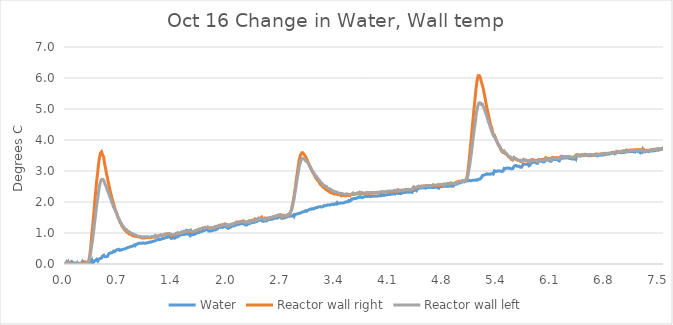
| Category | Water | Reactor wall right | Reactor wall left |
|---|---|---|---|
| 0.0015577622222222223 | 0 | 0 | 0 |
| 0.008027616666666666 | 0.023 | 0.004 | 0.005 |
| 0.014572455555555554 | 0.044 | 0.029 | 0.056 |
| 0.02137698611111111 | 0.004 | -0.011 | 0.006 |
| 0.028150972222222223 | 0.017 | 0.005 | 0.019 |
| 0.03498602777777778 | 0.058 | 0.04 | 0.029 |
| 0.04182113888888889 | -0.016 | -0.028 | -0.022 |
| 0.048596499999999994 | 0.018 | -0.005 | -0.014 |
| 0.055370472222222224 | 0.029 | 0.015 | 0.009 |
| 0.06214444444444445 | 0.032 | -0.035 | -0.028 |
| 0.06897952777777779 | 0.009 | -0.022 | 0 |
| 0.07578405555555556 | 0.063 | -0.003 | 0.008 |
| 0.08261913888888889 | -0.018 | -0.065 | -0.024 |
| 0.08939311111111112 | -0.002 | -0.02 | -0.014 |
| 0.09610600000000001 | 0.033 | -0.004 | -0.017 |
| 0.1029716111111111 | 0.01 | -0.025 | 0.003 |
| 0.10977613888888889 | -0.017 | -0.039 | -0.031 |
| 0.11655155555555556 | 0.016 | -0.023 | -0.015 |
| 0.12337130555555556 | 0.03 | -0.005 | 0.008 |
| 0.13017602777777776 | -0.014 | -0.045 | -0.048 |
| 0.13694983333333333 | 0.007 | -0.03 | -0.025 |
| 0.14370852777777776 | 0.016 | 0.004 | -0.009 |
| 0.15054361111111111 | 0.038 | 0.013 | 0.024 |
| 0.15731758333333334 | -0.002 | -0.054 | -0.031 |
| 0.16413738888888887 | -0.011 | -0.031 | -0.008 |
| 0.17091138888888888 | 0.024 | -0.007 | 0.002 |
| 0.1776867222222222 | 0.027 | -0.001 | -0.003 |
| 0.18449125 | 0.011 | -0.018 | -0.004 |
| 0.19132633333333335 | -0.006 | -0.021 | -0.027 |
| 0.19810033333333332 | 0.007 | -0.01 | -0.004 |
| 0.20487430555555555 | 0.023 | -0.005 | -0.004 |
| 0.2117246388888889 | 0.063 | 0.031 | 0.006 |
| 0.2184986388888889 | 0.002 | -0.021 | -0.005 |
| 0.22537952777777778 | -0.002 | -0.025 | -0.006 |
| 0.23210769444444446 | 0.007 | -0.021 | 0.023 |
| 0.23889694444444445 | 0.054 | 0.007 | 0.015 |
| 0.24567230555555555 | 0.057 | 0.04 | 0.036 |
| 0.2525073888888889 | 0.027 | -0.011 | -0.006 |
| 0.2592508055555556 | -0.008 | -0.011 | 0.006 |
| 0.2660901111111111 | 0.03 | 0.008 | 0.014 |
| 0.27287516666666667 | 0.035 | 0.018 | 0.019 |
| 0.279695 | 0.063 | 0.049 | 0.047 |
| 0.28643833333333335 | 0.05 | 0.07 | 0.06 |
| 0.2933344444444444 | 0.043 | 0.077 | 0.057 |
| 0.3000933333333333 | 0.018 | 0.146 | 0.092 |
| 0.3068825 | 0.041 | 0.259 | 0.175 |
| 0.3137022222222222 | 0.036 | 0.386 | 0.25 |
| 0.3204777777777778 | 0.059 | 0.543 | 0.368 |
| 0.3272363888888889 | 0.084 | 0.739 | 0.49 |
| 0.33404083333333334 | 0.119 | 0.944 | 0.621 |
| 0.3408761111111111 | 0.042 | 1.11 | 0.713 |
| 0.3476805555555556 | 0.045 | 1.285 | 0.849 |
| 0.35443916666666664 | 0.048 | 1.498 | 0.994 |
| 0.36127444444444445 | 0.066 | 1.679 | 1.128 |
| 0.3680483333333333 | 0.102 | 1.897 | 1.303 |
| 0.3748375 | 0.11 | 2.122 | 1.432 |
| 0.3816127777777778 | 0.115 | 2.303 | 1.586 |
| 0.38843277777777774 | 0.131 | 2.482 | 1.729 |
| 0.3952219444444444 | 0.151 | 2.67 | 1.89 |
| 0.40199583333333333 | 0.14 | 2.817 | 2.007 |
| 0.4088158333333334 | 0.099 | 2.966 | 2.119 |
| 0.41565083333333336 | 0.134 | 3.139 | 2.246 |
| 0.42247055555555557 | 0.14 | 3.287 | 2.386 |
| 0.4292294444444445 | 0.168 | 3.406 | 2.506 |
| 0.43600333333333335 | 0.168 | 3.496 | 2.575 |
| 0.44279250000000003 | 0.181 | 3.577 | 2.642 |
| 0.4495986111111111 | 0.204 | 3.603 | 2.708 |
| 0.45640305555555555 | 0.189 | 3.621 | 2.738 |
| 0.4631922222222222 | 0.214 | 3.565 | 2.733 |
| 0.4700272222222222 | 0.259 | 3.556 | 2.746 |
| 0.47680138888888884 | 0.268 | 3.49 | 2.723 |
| 0.48360583333333335 | 0.281 | 3.451 | 2.716 |
| 0.4903797222222222 | 0.245 | 3.322 | 2.664 |
| 0.49715388888888884 | 0.215 | 3.194 | 2.599 |
| 0.5039888888888888 | 0.235 | 3.127 | 2.554 |
| 0.5107475 | 0.231 | 3.03 | 2.52 |
| 0.5175688888888889 | 0.236 | 2.938 | 2.474 |
| 0.5243427777777778 | 0.26 | 2.849 | 2.421 |
| 0.5311777777777777 | 0.247 | 2.772 | 2.39 |
| 0.5379825 | 0.284 | 2.683 | 2.324 |
| 0.5447563888888889 | 0.304 | 2.603 | 2.288 |
| 0.5515761111111112 | 0.339 | 2.514 | 2.24 |
| 0.5583502777777778 | 0.326 | 2.442 | 2.181 |
| 0.5650936111111111 | 0.354 | 2.361 | 2.135 |
| 0.5719897222222222 | 0.357 | 2.279 | 2.094 |
| 0.5787788888888888 | 0.359 | 2.228 | 2.066 |
| 0.5855530555555556 | 0.377 | 2.136 | 1.989 |
| 0.5923130555555556 | 0.37 | 2.077 | 1.959 |
| 0.5991483333333334 | 0.38 | 2.019 | 1.91 |
| 0.6059222222222223 | 0.414 | 1.96 | 1.842 |
| 0.6127266666666666 | 0.401 | 1.899 | 1.831 |
| 0.6195158333333334 | 0.396 | 1.843 | 1.788 |
| 0.6263358333333334 | 0.401 | 1.774 | 1.742 |
| 0.6330944444444444 | 0.429 | 1.733 | 1.706 |
| 0.6399447222222222 | 0.442 | 1.672 | 1.668 |
| 0.6467186111111111 | 0.46 | 1.638 | 1.637 |
| 0.6535386111111111 | 0.466 | 1.598 | 1.576 |
| 0.6603138888888889 | 0.453 | 1.528 | 1.517 |
| 0.6671488888888889 | 0.461 | 1.487 | 1.512 |
| 0.6739230555555555 | 0.474 | 1.452 | 1.46 |
| 0.6807580555555555 | 0.452 | 1.407 | 1.434 |
| 0.6875013888888889 | 0.441 | 1.346 | 1.38 |
| 0.6943366666666667 | 0.453 | 1.332 | 1.356 |
| 0.7010952777777778 | 0.46 | 1.303 | 1.323 |
| 0.7079150000000001 | 0.446 | 1.248 | 1.292 |
| 0.7146891666666666 | 0.459 | 1.242 | 1.268 |
| 0.7214936111111111 | 0.472 | 1.198 | 1.232 |
| 0.7282688888888889 | 0.479 | 1.17 | 1.219 |
| 0.7350580555555555 | 0.472 | 1.142 | 1.201 |
| 0.7419238888888888 | 0.482 | 1.129 | 1.163 |
| 0.7486672222222223 | 0.49 | 1.095 | 1.15 |
| 0.7554869444444445 | 0.492 | 1.082 | 1.121 |
| 0.7622916666666667 | 0.505 | 1.057 | 1.134 |
| 0.7690808333333333 | 0.51 | 1.039 | 1.114 |
| 0.7759158333333334 | 0.523 | 1.028 | 1.072 |
| 0.7826441666666666 | 0.528 | 1.02 | 1.08 |
| 0.7894347222222222 | 0.518 | 1.008 | 1.059 |
| 0.7962391666666666 | 0.539 | 1.005 | 1.057 |
| 0.8031202777777778 | 0.531 | 0.969 | 1.044 |
| 0.8098941666666667 | 0.549 | 0.961 | 1.016 |
| 0.8166986111111111 | 0.541 | 0.964 | 1.018 |
| 0.8235030555555555 | 0.562 | 0.948 | 1.018 |
| 0.8302466666666667 | 0.549 | 0.951 | 0.99 |
| 0.8370205555555555 | 0.57 | 0.925 | 0.998 |
| 0.843825 | 0.575 | 0.917 | 0.982 |
| 0.8506602777777778 | 0.577 | 0.904 | 0.954 |
| 0.8574647222222223 | 0.58 | 0.907 | 0.964 |
| 0.86424 | 0.605 | 0.908 | 0.951 |
| 0.8711211111111111 | 0.597 | 0.898 | 0.949 |
| 0.8778644444444444 | 0.588 | 0.894 | 0.936 |
| 0.8846383333333333 | 0.629 | 0.889 | 0.938 |
| 0.8914736111111111 | 0.619 | 0.889 | 0.91 |
| 0.8982016666666667 | 0.638 | 0.888 | 0.915 |
| 0.905021388888889 | 0.642 | 0.885 | 0.889 |
| 0.9117802777777778 | 0.654 | 0.885 | 0.897 |
| 0.9186305555555556 | 0.65 | 0.867 | 0.892 |
| 0.9254349999999999 | 0.668 | 0.87 | 0.889 |
| 0.9322102777777778 | 0.655 | 0.878 | 0.897 |
| 0.9389997222222222 | 0.668 | 0.878 | 0.894 |
| 0.9458347222222222 | 0.676 | 0.865 | 0.879 |
| 0.9526238888888888 | 0.668 | 0.852 | 0.884 |
| 0.9594591666666666 | 0.676 | 0.849 | 0.879 |
| 0.9662483333333334 | 0.668 | 0.836 | 0.871 |
| 0.9729763888888889 | 0.676 | 0.834 | 0.879 |
| 0.9797811111111111 | 0.681 | 0.839 | 0.874 |
| 0.9865702777777777 | 0.681 | 0.839 | 0.879 |
| 0.99339 | 0.668 | 0.836 | 0.884 |
| 1.0001652777777776 | 0.658 | 0.836 | 0.863 |
| 1.0069547222222222 | 0.666 | 0.844 | 0.874 |
| 1.0137744444444445 | 0.681 | 0.831 | 0.884 |
| 1.0205636111111112 | 0.681 | 0.852 | 0.881 |
| 1.0273836111111112 | 0.676 | 0.841 | 0.876 |
| 1.0341575 | 0.686 | 0.849 | 0.879 |
| 1.0409466666666667 | 0.666 | 0.852 | 0.861 |
| 1.047751388888889 | 0.694 | 0.854 | 0.869 |
| 1.0545252777777778 | 0.704 | 0.849 | 0.874 |
| 1.0613602777777777 | 0.707 | 0.844 | 0.856 |
| 1.0681358333333333 | 0.712 | 0.86 | 0.887 |
| 1.074986111111111 | 0.702 | 0.849 | 0.876 |
| 1.081836388888889 | 0.704 | 0.847 | 0.899 |
| 1.088595 | 0.722 | 0.867 | 0.881 |
| 1.095353888888889 | 0.728 | 0.854 | 0.879 |
| 1.1021277777777778 | 0.728 | 0.867 | 0.881 |
| 1.1089016666666667 | 0.738 | 0.854 | 0.887 |
| 1.1157522222222223 | 0.743 | 0.872 | 0.871 |
| 1.1225719444444444 | 0.751 | 0.87 | 0.894 |
| 1.129361111111111 | 0.746 | 0.87 | 0.912 |
| 1.1361366666666668 | 0.746 | 0.88 | 0.879 |
| 1.1429105555555557 | 0.766 | 0.893 | 0.894 |
| 1.1496844444444443 | 0.766 | 0.885 | 0.907 |
| 1.1565349999999999 | 0.782 | 0.888 | 0.892 |
| 1.1633241666666665 | 0.789 | 0.914 | 0.907 |
| 1.1700980555555556 | 0.795 | 0.896 | 0.91 |
| 1.1768719444444444 | 0.782 | 0.906 | 0.91 |
| 1.1837225 | 0.784 | 0.906 | 0.905 |
| 1.1905575 | 0.8 | 0.929 | 0.912 |
| 1.1972855555555555 | 0.797 | 0.937 | 0.925 |
| 1.204061111111111 | 0.81 | 0.921 | 0.933 |
| 1.210896111111111 | 0.805 | 0.927 | 0.956 |
| 1.217731111111111 | 0.795 | 0.934 | 0.923 |
| 1.2245052777777778 | 0.823 | 0.927 | 0.93 |
| 1.2312791666666665 | 0.828 | 0.939 | 0.946 |
| 1.238083611111111 | 0.826 | 0.947 | 0.954 |
| 1.2448577777777778 | 0.849 | 0.937 | 0.961 |
| 1.2516927777777778 | 0.838 | 0.945 | 0.943 |
| 1.2584972222222222 | 0.851 | 0.945 | 0.941 |
| 1.2653169444444443 | 0.851 | 0.968 | 0.959 |
| 1.2720772222222223 | 0.841 | 0.958 | 0.969 |
| 1.2788969444444445 | 0.862 | 0.958 | 0.972 |
| 1.285625 | 0.864 | 0.968 | 0.982 |
| 1.2924908333333331 | 0.877 | 0.973 | 0.972 |
| 1.2993105555555555 | 0.882 | 0.958 | 0.979 |
| 1.3060844444444446 | 0.893 | 0.978 | 0.998 |
| 1.3128738888888887 | 0.871 | 0.974 | 0.964 |
| 1.3196783333333333 | 0.857 | 0.953 | 0.961 |
| 1.3264522222222221 | 0.837 | 0.949 | 0.968 |
| 1.3332569444444446 | 0.824 | 0.913 | 0.939 |
| 1.3400627777777776 | 0.811 | 0.924 | 0.939 |
| 1.3468366666666667 | 0.834 | 0.918 | 0.934 |
| 1.3536108333333332 | 0.839 | 0.939 | 0.947 |
| 1.3604305555555556 | 0.86 | 0.947 | 0.952 |
| 1.3672044444444444 | 0.829 | 0.942 | 0.95 |
| 1.37407 | 0.834 | 0.942 | 0.965 |
| 1.3808288888888889 | 0.865 | 0.962 | 0.965 |
| 1.3876027777777777 | 0.865 | 0.947 | 0.991 |
| 1.3944225000000001 | 0.89 | 0.983 | 0.976 |
| 1.4011966666666666 | 0.861 | 0.973 | 0.955 |
| 1.4080330555555556 | 0.878 | 0.97 | 0.968 |
| 1.4148986111111113 | 0.889 | 1.005 | 0.994 |
| 1.4216269444444445 | 0.892 | 1.008 | 0.976 |
| 1.428416111111111 | 0.902 | 0.995 | 0.999 |
| 1.4351747222222222 | 0.92 | 1.008 | 0.988 |
| 1.441994722222222 | 0.938 | 0.997 | 0.999 |
| 1.4487991666666666 | 0.914 | 1.023 | 1.004 |
| 1.455603611111111 | 0.953 | 1.018 | 0.991 |
| 1.4624080555555554 | 0.925 | 1.039 | 1.017 |
| 1.4691822222222222 | 0.943 | 1.039 | 1.014 |
| 1.4759575 | 0.935 | 1.028 | 1.012 |
| 1.4827925 | 0.958 | 1.026 | 1.03 |
| 1.4895819444444445 | 0.961 | 1.044 | 1.037 |
| 1.496371111111111 | 0.951 | 1.054 | 1.022 |
| 1.5031755555555555 | 0.945 | 1.046 | 1.043 |
| 1.5099344444444445 | 0.971 | 1.059 | 1.03 |
| 1.5167847222222224 | 0.979 | 1.049 | 1.045 |
| 1.5235738888888888 | 0.966 | 1.088 | 1.066 |
| 1.5303783333333334 | 0.992 | 1.07 | 1.048 |
| 1.5371525 | 0.971 | 1.077 | 1.076 |
| 1.5439430555555556 | 0.982 | 1.085 | 1.058 |
| 1.5507780555555557 | 0.979 | 1.083 | 1.089 |
| 1.5575675000000002 | 0.976 | 1.081 | 1.073 |
| 1.5644025000000001 | 0.931 | 1.051 | 1.042 |
| 1.5711458333333332 | 0.991 | 1.078 | 1.065 |
| 1.577981111111111 | 0.927 | 1.079 | 1.047 |
| 1.5847091666666668 | 0.936 | 1.036 | 1.047 |
| 1.5915288888888888 | 0.939 | 1.051 | 1.052 |
| 1.5983488888888888 | 0.949 | 1.051 | 1.046 |
| 1.6051227777777777 | 0.959 | 1.051 | 1.041 |
| 1.6119591666666666 | 0.962 | 1.051 | 1.054 |
| 1.6187944444444444 | 0.949 | 1.072 | 1.057 |
| 1.6255377777777777 | 0.962 | 1.064 | 1.057 |
| 1.6323116666666666 | 0.98 | 1.085 | 1.062 |
| 1.6391619444444445 | 0.971 | 1.073 | 1.067 |
| 1.6459055555555555 | 0.98 | 1.064 | 1.077 |
| 1.6526794444444444 | 0.993 | 1.086 | 1.09 |
| 1.6595144444444445 | 1.011 | 1.1 | 1.085 |
| 1.6663358333333333 | 1.01 | 1.095 | 1.106 |
| 1.6730930555555557 | 1.014 | 1.117 | 1.08 |
| 1.6798683333333333 | 1.027 | 1.115 | 1.124 |
| 1.6866730555555556 | 1.022 | 1.135 | 1.126 |
| 1.6934775 | 1.034 | 1.13 | 1.111 |
| 1.7002819444444446 | 1.055 | 1.141 | 1.116 |
| 1.707056111111111 | 1.057 | 1.13 | 1.119 |
| 1.7138758333333335 | 1.05 | 1.148 | 1.121 |
| 1.7206497222222221 | 1.057 | 1.151 | 1.15 |
| 1.7275152777777778 | 1.062 | 1.151 | 1.142 |
| 1.7342894444444446 | 1.047 | 1.161 | 1.15 |
| 1.7410633333333334 | 1.073 | 1.169 | 1.137 |
| 1.747838611111111 | 1.085 | 1.169 | 1.152 |
| 1.7547197222222222 | 1.09 | 1.164 | 1.16 |
| 1.7614783333333333 | 1.083 | 1.184 | 1.175 |
| 1.7682980555555554 | 1.113 | 1.177 | 1.17 |
| 1.7750263888888889 | 1.101 | 1.174 | 1.17 |
| 1.781846111111111 | 1.111 | 1.2 | 1.173 |
| 1.7886811111111112 | 1.106 | 1.192 | 1.186 |
| 1.795455277777778 | 1.104 | 1.179 | 1.178 |
| 1.8022902777777778 | 1.061 | 1.16 | 1.154 |
| 1.8090641666666667 | 1.077 | 1.16 | 1.164 |
| 1.8158841666666667 | 1.061 | 1.151 | 1.154 |
| 1.8226288888888889 | 1.053 | 1.166 | 1.156 |
| 1.829402777777778 | 1.063 | 1.171 | 1.177 |
| 1.8362224999999999 | 1.061 | 1.171 | 1.159 |
| 1.8430425000000001 | 1.076 | 1.171 | 1.156 |
| 1.8498163888888888 | 1.086 | 1.176 | 1.169 |
| 1.8566666666666667 | 1.084 | 1.169 | 1.156 |
| 1.8634255555555557 | 1.073 | 1.184 | 1.179 |
| 1.8702605555555556 | 1.108 | 1.178 | 1.187 |
| 1.8770191666666667 | 1.099 | 1.184 | 1.182 |
| 1.8838544444444445 | 1.096 | 1.206 | 1.182 |
| 1.8906297222222221 | 1.117 | 1.2 | 1.208 |
| 1.8974341666666668 | 1.117 | 1.213 | 1.182 |
| 1.9042080555555556 | 1.136 | 1.211 | 1.2 |
| 1.9109822222222221 | 1.133 | 1.219 | 1.208 |
| 1.9177408333333335 | 1.135 | 1.235 | 1.202 |
| 1.9245605555555554 | 1.171 | 1.227 | 1.213 |
| 1.9313958333333332 | 1.145 | 1.235 | 1.215 |
| 1.9381697222222223 | 1.191 | 1.248 | 1.226 |
| 1.94502 | 1.163 | 1.255 | 1.231 |
| 1.9517955555555555 | 1.178 | 1.258 | 1.226 |
| 1.9586000000000001 | 1.178 | 1.248 | 1.249 |
| 1.9653738888888888 | 1.196 | 1.263 | 1.239 |
| 1.9721480555555555 | 1.194 | 1.286 | 1.246 |
| 1.9789525000000001 | 1.181 | 1.263 | 1.246 |
| 1.9857569444444445 | 1.212 | 1.284 | 1.251 |
| 1.9925919444444444 | 1.209 | 1.278 | 1.269 |
| 1.9993661111111112 | 1.201 | 1.281 | 1.251 |
| 2.006231666666667 | 1.209 | 1.294 | 1.269 |
| 2.012929166666667 | 1.224 | 1.297 | 1.269 |
| 2.019781111111111 | 1.193 | 1.277 | 1.254 |
| 2.026555 | 1.206 | 1.279 | 1.264 |
| 2.0333441666666667 | 1.184 | 1.276 | 1.264 |
| 2.0401183333333335 | 1.19 | 1.28 | 1.269 |
| 2.0469227777777776 | 1.149 | 1.232 | 1.227 |
| 2.0537425 | 1.164 | 1.227 | 1.245 |
| 2.060486111111111 | 1.172 | 1.242 | 1.255 |
| 2.0673669444444442 | 1.177 | 1.258 | 1.263 |
| 2.0741408333333333 | 1.177 | 1.27 | 1.247 |
| 2.080914722222222 | 1.191 | 1.283 | 1.268 |
| 2.0877208333333335 | 1.209 | 1.276 | 1.278 |
| 2.0945252777777776 | 1.197 | 1.271 | 1.278 |
| 2.1013297222222223 | 1.227 | 1.29 | 1.266 |
| 2.108103888888889 | 1.223 | 1.303 | 1.296 |
| 2.114908333333333 | 1.228 | 1.295 | 1.289 |
| 2.1217433333333333 | 1.233 | 1.318 | 1.284 |
| 2.1285175 | 1.236 | 1.316 | 1.299 |
| 2.1353066666666667 | 1.249 | 1.316 | 1.315 |
| 2.142141666666667 | 1.261 | 1.331 | 1.32 |
| 2.148931111111111 | 1.249 | 1.329 | 1.307 |
| 2.1557216666666665 | 1.264 | 1.357 | 1.33 |
| 2.1624802777777776 | 1.246 | 1.334 | 1.302 |
| 2.1693155555555554 | 1.272 | 1.352 | 1.33 |
| 2.17612 | 1.287 | 1.36 | 1.333 |
| 2.1828938888888887 | 1.284 | 1.349 | 1.333 |
| 2.1897441666666664 | 1.287 | 1.373 | 1.34 |
| 2.1965183333333336 | 1.287 | 1.357 | 1.364 |
| 2.2032616666666667 | 1.295 | 1.378 | 1.356 |
| 2.210096666666667 | 1.315 | 1.38 | 1.361 |
| 2.2168555555555556 | 1.312 | 1.383 | 1.369 |
| 2.2236155555555555 | 1.302 | 1.378 | 1.358 |
| 2.2304505555555556 | 1.325 | 1.38 | 1.374 |
| 2.237255277777778 | 1.317 | 1.393 | 1.374 |
| 2.2441055555555556 | 1.308 | 1.378 | 1.384 |
| 2.2508488888888887 | 1.281 | 1.366 | 1.358 |
| 2.2576686111111113 | 1.307 | 1.391 | 1.355 |
| 2.2644427777777776 | 1.257 | 1.357 | 1.321 |
| 2.2712777777777777 | 1.257 | 1.354 | 1.331 |
| 2.2780669444444444 | 1.257 | 1.359 | 1.334 |
| 2.284856388888889 | 1.262 | 1.349 | 1.352 |
| 2.2916608333333333 | 1.285 | 1.357 | 1.362 |
| 2.298497222222222 | 1.266 | 1.353 | 1.349 |
| 2.3052408333333334 | 1.307 | 1.376 | 1.344 |
| 2.3120147222222225 | 1.31 | 1.397 | 1.38 |
| 2.3188038888888887 | 1.303 | 1.392 | 1.365 |
| 2.3256391666666665 | 1.314 | 1.412 | 1.354 |
| 2.332443611111111 | 1.337 | 1.397 | 1.388 |
| 2.3392175 | 1.334 | 1.405 | 1.38 |
| 2.3460219444444443 | 1.334 | 1.405 | 1.385 |
| 2.3529030555555552 | 1.314 | 1.405 | 1.406 |
| 2.359556111111111 | 1.354 | 1.42 | 1.398 |
| 2.3664216666666666 | 1.357 | 1.41 | 1.393 |
| 2.373195833333333 | 1.339 | 1.423 | 1.411 |
| 2.380046111111111 | 1.357 | 1.438 | 1.419 |
| 2.386789444444444 | 1.362 | 1.456 | 1.393 |
| 2.393594166666667 | 1.365 | 1.448 | 1.416 |
| 2.4004291666666666 | 1.365 | 1.438 | 1.432 |
| 2.4072030555555557 | 1.377 | 1.469 | 1.437 |
| 2.4139925 | 1.38 | 1.446 | 1.442 |
| 2.4208274999999997 | 1.365 | 1.458 | 1.442 |
| 2.4276166666666668 | 1.406 | 1.469 | 1.471 |
| 2.4343311111111112 | 1.388 | 1.458 | 1.437 |
| 2.4412119444444444 | 1.411 | 1.474 | 1.465 |
| 2.447985833333333 | 1.403 | 1.489 | 1.471 |
| 2.454790277777778 | 1.413 | 1.486 | 1.442 |
| 2.4615644444444444 | 1.411 | 1.494 | 1.468 |
| 2.468399444444444 | 1.439 | 1.514 | 1.491 |
| 2.475188611111111 | 1.387 | 1.477 | 1.46 |
| 2.481962777777778 | 1.403 | 1.469 | 1.452 |
| 2.488751944444444 | 1.379 | 1.465 | 1.462 |
| 2.4955869444444443 | 1.376 | 1.451 | 1.444 |
| 2.502377777777778 | 1.381 | 1.448 | 1.433 |
| 2.5092280555555555 | 1.377 | 1.436 | 1.469 |
| 2.515956111111111 | 1.394 | 1.452 | 1.456 |
| 2.5228066666666664 | 1.402 | 1.458 | 1.436 |
| 2.5295194444444444 | 1.391 | 1.483 | 1.456 |
| 2.536325277777778 | 1.409 | 1.477 | 1.451 |
| 2.5431588888888887 | 1.417 | 1.475 | 1.449 |
| 2.5499941666666666 | 1.414 | 1.485 | 1.461 |
| 2.5567527777777777 | 1.432 | 1.48 | 1.477 |
| 2.563512777777778 | 1.419 | 1.498 | 1.492 |
| 2.570332777777778 | 1.437 | 1.495 | 1.482 |
| 2.577106666666667 | 1.45 | 1.516 | 1.492 |
| 2.583895833333333 | 1.442 | 1.506 | 1.48 |
| 2.590731111111111 | 1.448 | 1.508 | 1.5 |
| 2.597520277777778 | 1.445 | 1.503 | 1.485 |
| 2.6043858333333336 | 1.463 | 1.521 | 1.51 |
| 2.6111138888888887 | 1.463 | 1.523 | 1.505 |
| 2.617918611111111 | 1.46 | 1.518 | 1.513 |
| 2.6247536111111107 | 1.468 | 1.526 | 1.498 |
| 2.6315275 | 1.468 | 1.536 | 1.531 |
| 2.6382725000000002 | 1.476 | 1.536 | 1.534 |
| 2.6451227777777775 | 1.463 | 1.541 | 1.526 |
| 2.6518969444444442 | 1.486 | 1.554 | 1.503 |
| 2.6586708333333333 | 1.483 | 1.549 | 1.556 |
| 2.665536388888889 | 1.478 | 1.559 | 1.539 |
| 2.672279722222222 | 1.499 | 1.567 | 1.551 |
| 2.679145555555556 | 1.506 | 1.582 | 1.541 |
| 2.685919444444444 | 1.514 | 1.577 | 1.559 |
| 2.692769722222222 | 1.516 | 1.59 | 1.564 |
| 2.699468611111111 | 1.511 | 1.592 | 1.569 |
| 2.7062733333333338 | 1.545 | 1.592 | 1.579 |
| 2.713077777777778 | 1.539 | 1.592 | 1.572 |
| 2.719882222222222 | 1.475 | 1.533 | 1.533 |
| 2.726671666666667 | 1.456 | 1.51 | 1.53 |
| 2.7334455555555555 | 1.487 | 1.563 | 1.543 |
| 2.740234722222222 | 1.483 | 1.526 | 1.56 |
| 2.74707 | 1.487 | 1.539 | 1.568 |
| 2.7538591666666665 | 1.493 | 1.558 | 1.547 |
| 2.7606330555555556 | 1.492 | 1.55 | 1.545 |
| 2.767439166666667 | 1.502 | 1.55 | 1.553 |
| 2.774258888888889 | 1.515 | 1.548 | 1.553 |
| 2.7810777777777775 | 1.523 | 1.573 | 1.555 |
| 2.787822222222222 | 1.52 | 1.553 | 1.555 |
| 2.794597222222222 | 1.523 | 1.586 | 1.565 |
| 2.8014916666666667 | 1.538 | 1.601 | 1.586 |
| 2.808236111111111 | 1.551 | 1.571 | 1.558 |
| 2.8150083333333336 | 1.538 | 1.611 | 1.596 |
| 2.8218 | 1.556 | 1.614 | 1.614 |
| 2.8286194444444446 | 1.559 | 1.662 | 1.657 |
| 2.8354222222222223 | 1.559 | 1.711 | 1.685 |
| 2.842258333333333 | 1.543 | 1.744 | 1.724 |
| 2.8490333333333333 | 1.566 | 1.851 | 1.798 |
| 2.855838888888889 | 1.553 | 1.92 | 1.877 |
| 2.8626722222222223 | 1.569 | 2.007 | 1.945 |
| 2.8694027777777777 | 1.584 | 2.109 | 2.037 |
| 2.876175 | 1.543 | 2.224 | 2.119 |
| 2.8830416666666667 | 1.579 | 2.344 | 2.239 |
| 2.889813888888889 | 1.592 | 2.433 | 2.326 |
| 2.896575 | 1.599 | 2.589 | 2.463 |
| 2.903363888888889 | 1.602 | 2.711 | 2.566 |
| 2.9101527777777774 | 1.617 | 2.836 | 2.685 |
| 2.9170194444444446 | 1.633 | 2.966 | 2.793 |
| 2.9238555555555554 | 1.62 | 3.086 | 2.887 |
| 2.930597222222222 | 1.617 | 3.211 | 2.999 |
| 2.9374333333333333 | 1.635 | 3.334 | 3.096 |
| 2.9441916666666668 | 1.638 | 3.403 | 3.196 |
| 2.9509666666666665 | 1.64 | 3.482 | 3.247 |
| 2.9577861111111114 | 1.656 | 3.523 | 3.308 |
| 2.964588888888889 | 1.656 | 3.553 | 3.351 |
| 2.971363888888889 | 1.661 | 3.586 | 3.374 |
| 2.9782166666666665 | 1.676 | 3.586 | 3.41 |
| 2.9849888888888887 | 1.681 | 3.586 | 3.41 |
| 2.9917472222222226 | 1.686 | 3.566 | 3.395 |
| 2.9985999999999997 | 1.709 | 3.54 | 3.392 |
| 3.0053722222222223 | 1.691 | 3.538 | 3.392 |
| 3.012147222222222 | 1.701 | 3.494 | 3.369 |
| 3.018997222222222 | 1.719 | 3.464 | 3.331 |
| 3.0257722222222223 | 1.717 | 3.443 | 3.321 |
| 3.032575 | 1.701 | 3.387 | 3.308 |
| 3.039411111111111 | 1.732 | 3.359 | 3.285 |
| 3.046138888888889 | 1.732 | 3.311 | 3.265 |
| 3.052913888888889 | 1.73 | 3.28 | 3.239 |
| 3.0596888888888887 | 1.747 | 3.234 | 3.219 |
| 3.0665694444444442 | 1.732 | 3.201 | 3.175 |
| 3.073372222222222 | 1.77 | 3.16 | 3.155 |
| 3.0801166666666666 | 1.77 | 3.127 | 3.101 |
| 3.0868916666666664 | 1.763 | 3.076 | 3.073 |
| 3.0937416666666664 | 1.773 | 3.04 | 3.071 |
| 3.100513888888889 | 1.786 | 3.002 | 3.02 |
| 3.1072888888888888 | 1.778 | 2.966 | 2.997 |
| 3.114125 | 1.775 | 2.948 | 2.979 |
| 3.1209444444444445 | 1.796 | 2.913 | 2.941 |
| 3.1277333333333335 | 1.791 | 2.885 | 2.91 |
| 3.1345083333333332 | 1.796 | 2.846 | 2.892 |
| 3.1412666666666667 | 1.801 | 2.8 | 2.874 |
| 3.148102777777778 | 1.804 | 2.77 | 2.831 |
| 3.154922222222222 | 1.824 | 2.755 | 2.813 |
| 3.161772222222222 | 1.806 | 2.737 | 2.818 |
| 3.168547222222222 | 1.819 | 2.703 | 2.767 |
| 3.1753055555555556 | 1.814 | 2.678 | 2.749 |
| 3.1820805555555554 | 1.842 | 2.67 | 2.736 |
| 3.1889000000000003 | 1.821 | 2.635 | 2.711 |
| 3.1957055555555556 | 1.844 | 2.601 | 2.693 |
| 3.2024944444444445 | 1.834 | 2.586 | 2.657 |
| 3.2092694444444447 | 1.844 | 2.561 | 2.642 |
| 3.2160416666666665 | 1.844 | 2.55 | 2.632 |
| 3.222861111111111 | 1.839 | 2.535 | 2.599 |
| 3.2296805555555554 | 1.857 | 2.507 | 2.599 |
| 3.2364555555555556 | 1.852 | 2.484 | 2.578 |
| 3.2433055555555557 | 1.847 | 2.469 | 2.535 |
| 3.250080555555556 | 1.883 | 2.464 | 2.553 |
| 3.2568555555555556 | 1.865 | 2.459 | 2.53 |
| 3.263691666666667 | 1.875 | 2.438 | 2.515 |
| 3.270463888888889 | 1.87 | 2.413 | 2.509 |
| 3.2772694444444443 | 1.88 | 2.395 | 2.489 |
| 3.2840416666666665 | 1.895 | 2.397 | 2.497 |
| 3.290847222222222 | 1.906 | 2.385 | 2.461 |
| 3.2976666666666667 | 1.888 | 2.385 | 2.446 |
| 3.3044555555555557 | 1.906 | 2.351 | 2.438 |
| 3.3112305555555555 | 1.893 | 2.354 | 2.433 |
| 3.3180055555555557 | 1.9 | 2.336 | 2.428 |
| 3.324811111111111 | 1.908 | 2.323 | 2.42 |
| 3.3315833333333336 | 1.906 | 2.305 | 2.415 |
| 3.3383888888888893 | 1.906 | 2.311 | 2.392 |
| 3.3452555555555556 | 1.926 | 2.295 | 2.384 |
| 3.3520444444444446 | 1.911 | 2.303 | 2.382 |
| 3.358802777777778 | 1.926 | 2.285 | 2.369 |
| 3.3656083333333333 | 1.906 | 2.29 | 2.372 |
| 3.372411111111111 | 1.916 | 2.265 | 2.336 |
| 3.3792166666666668 | 1.936 | 2.27 | 2.346 |
| 3.386036111111111 | 1.941 | 2.257 | 2.328 |
| 3.3928277777777778 | 1.941 | 2.26 | 2.326 |
| 3.3996166666666667 | 1.936 | 2.26 | 2.331 |
| 3.406388888888889 | 1.944 | 2.249 | 2.31 |
| 3.413177777777778 | 1.977 | 2.252 | 2.315 |
| 3.419922222222222 | 1.939 | 2.244 | 2.3 |
| 3.426727777777778 | 1.962 | 2.239 | 2.295 |
| 3.433561111111111 | 1.957 | 2.239 | 2.313 |
| 3.4403972222222223 | 1.957 | 2.231 | 2.285 |
| 3.4471416666666665 | 1.959 | 2.244 | 2.287 |
| 3.453947222222222 | 1.939 | 2.229 | 2.275 |
| 3.460736111111111 | 1.967 | 2.219 | 2.27 |
| 3.467602777777778 | 1.954 | 2.201 | 2.282 |
| 3.4743444444444442 | 1.969 | 2.214 | 2.264 |
| 3.4812111111111115 | 1.972 | 2.221 | 2.267 |
| 3.4879527777777777 | 1.969 | 2.196 | 2.252 |
| 3.494788888888889 | 1.99 | 2.208 | 2.262 |
| 3.5015944444444442 | 1.974 | 2.201 | 2.241 |
| 3.508397222222222 | 1.967 | 2.203 | 2.236 |
| 3.5151416666666666 | 1.997 | 2.198 | 2.244 |
| 3.5219944444444446 | 1.991 | 2.197 | 2.254 |
| 3.5287361111111113 | 2.001 | 2.218 | 2.27 |
| 3.535572222222222 | 1.972 | 2.211 | 2.264 |
| 3.542375 | 2.01 | 2.191 | 2.234 |
| 3.549211111111111 | 2.021 | 2.215 | 2.255 |
| 3.5559388888888885 | 2.007 | 2.215 | 2.249 |
| 3.5627277777777775 | 2.044 | 2.215 | 2.25 |
| 3.5695333333333332 | 2.044 | 2.205 | 2.257 |
| 3.576352777777778 | 2.029 | 2.203 | 2.234 |
| 3.5831416666666667 | 2.061 | 2.24 | 2.263 |
| 3.589933333333333 | 2.056 | 2.232 | 2.25 |
| 3.5967083333333334 | 2.095 | 2.249 | 2.268 |
| 3.603511111111111 | 2.078 | 2.25 | 2.265 |
| 3.6102861111111113 | 2.092 | 2.242 | 2.271 |
| 3.617088888888889 | 2.104 | 2.242 | 2.294 |
| 3.623911111111111 | 2.115 | 2.259 | 2.265 |
| 3.6306833333333333 | 2.122 | 2.252 | 2.266 |
| 3.6375333333333337 | 2.116 | 2.244 | 2.276 |
| 3.6442916666666667 | 2.123 | 2.276 | 2.266 |
| 3.6511277777777775 | 2.111 | 2.27 | 2.273 |
| 3.657902777777778 | 2.143 | 2.279 | 2.276 |
| 3.664677777777778 | 2.131 | 2.266 | 2.291 |
| 3.671497222222222 | 2.131 | 2.261 | 2.296 |
| 3.678286111111111 | 2.143 | 2.261 | 2.299 |
| 3.685122222222222 | 2.151 | 2.259 | 2.279 |
| 3.691863888888889 | 2.151 | 2.297 | 2.296 |
| 3.698638888888889 | 2.154 | 2.266 | 2.314 |
| 3.705475 | 2.154 | 2.248 | 2.286 |
| 3.7122472222222225 | 2.179 | 2.279 | 2.296 |
| 3.719127777777778 | 2.159 | 2.261 | 2.296 |
| 3.7258722222222223 | 2.161 | 2.276 | 2.312 |
| 3.732663888888889 | 2.142 | 2.27 | 2.304 |
| 3.739436111111111 | 2.154 | 2.289 | 2.289 |
| 3.746286111111111 | 2.159 | 2.274 | 2.294 |
| 3.753077777777778 | 2.169 | 2.261 | 2.268 |
| 3.7598499999999997 | 2.174 | 2.276 | 2.294 |
| 3.7666388888888886 | 2.174 | 2.287 | 2.296 |
| 3.7734138888888893 | 2.185 | 2.285 | 2.299 |
| 3.7802194444444446 | 2.166 | 2.292 | 2.284 |
| 3.787052777777778 | 2.174 | 2.279 | 2.309 |
| 3.793827777777778 | 2.165 | 2.285 | 2.307 |
| 3.800677777777778 | 2.179 | 2.28 | 2.296 |
| 3.807422222222222 | 2.2 | 2.287 | 2.294 |
| 3.8141972222222225 | 2.184 | 2.271 | 2.289 |
| 3.821 | 2.189 | 2.279 | 2.302 |
| 3.8278055555555555 | 2.176 | 2.301 | 2.307 |
| 3.8346416666666663 | 2.189 | 2.292 | 2.291 |
| 3.8414305555555552 | 2.177 | 2.283 | 2.312 |
| 3.8482194444444446 | 2.17 | 2.288 | 2.304 |
| 3.8549916666666664 | 2.185 | 2.285 | 2.312 |
| 3.861813888888889 | 2.171 | 2.294 | 2.302 |
| 3.868588888888889 | 2.191 | 2.288 | 2.304 |
| 3.875391666666667 | 2.191 | 2.295 | 2.296 |
| 3.8821666666666665 | 2.188 | 2.302 | 2.319 |
| 3.889002777777778 | 2.186 | 2.321 | 2.307 |
| 3.8957750000000004 | 2.19 | 2.293 | 2.291 |
| 3.9025805555555557 | 2.175 | 2.291 | 2.309 |
| 3.9093555555555555 | 2.19 | 2.304 | 2.319 |
| 3.916225 | 2.21 | 2.286 | 2.317 |
| 3.923008333333333 | 2.188 | 2.299 | 2.312 |
| 3.9298 | 2.205 | 2.294 | 2.312 |
| 3.9365583333333336 | 2.198 | 2.289 | 2.317 |
| 3.9433944444444444 | 2.203 | 2.304 | 2.302 |
| 3.9501527777777774 | 2.218 | 2.304 | 2.314 |
| 3.956955555555556 | 2.19 | 2.286 | 2.33 |
| 3.963808333333333 | 2.198 | 2.302 | 2.319 |
| 3.970580555555556 | 2.226 | 2.314 | 2.327 |
| 3.977386111111111 | 2.216 | 2.297 | 2.342 |
| 3.9841583333333332 | 2.213 | 2.302 | 2.332 |
| 3.9909333333333334 | 2.213 | 2.32 | 2.327 |
| 3.997738888888889 | 2.223 | 2.322 | 2.33 |
| 4.004527777777778 | 2.21 | 2.312 | 2.327 |
| 4.011316666666667 | 2.228 | 2.309 | 2.309 |
| 4.018138888888888 | 2.226 | 2.327 | 2.33 |
| 4.024911111111111 | 2.216 | 2.309 | 2.322 |
| 4.031747222222222 | 2.223 | 2.325 | 2.332 |
| 4.038536111111111 | 2.218 | 2.317 | 2.337 |
| 4.045355555555556 | 2.233 | 2.337 | 2.332 |
| 4.052113888888889 | 2.233 | 2.32 | 2.355 |
| 4.058919444444444 | 2.249 | 2.325 | 2.353 |
| 4.0656944444444445 | 2.249 | 2.327 | 2.342 |
| 4.0725444444444445 | 2.241 | 2.337 | 2.347 |
| 4.07935 | 2.231 | 2.327 | 2.355 |
| 4.0860916666666665 | 2.244 | 2.332 | 2.358 |
| 4.092913888888889 | 2.244 | 2.33 | 2.345 |
| 4.099672222222222 | 2.269 | 2.337 | 2.376 |
| 4.106491666666667 | 2.244 | 2.34 | 2.358 |
| 4.113294444444445 | 2.259 | 2.335 | 2.36 |
| 4.120069444444445 | 2.264 | 2.34 | 2.358 |
| 4.126875 | 2.264 | 2.345 | 2.355 |
| 4.13365 | 2.279 | 2.35 | 2.376 |
| 4.140499999999999 | 2.256 | 2.355 | 2.383 |
| 4.147288888888889 | 2.292 | 2.35 | 2.355 |
| 4.1541250000000005 | 2.269 | 2.35 | 2.355 |
| 4.160822222222222 | 2.287 | 2.378 | 2.376 |
| 4.1677027777777775 | 2.279 | 2.342 | 2.378 |
| 4.174508333333333 | 2.279 | 2.363 | 2.353 |
| 4.1812805555555554 | 2.274 | 2.388 | 2.383 |
| 4.188069444444444 | 2.274 | 2.358 | 2.383 |
| 4.194861111111111 | 2.274 | 2.358 | 2.368 |
| 4.201694444444445 | 2.274 | 2.363 | 2.376 |
| 4.2085 | 2.282 | 2.368 | 2.373 |
| 4.215275 | 2.272 | 2.381 | 2.378 |
| 4.222094444444445 | 2.305 | 2.373 | 2.358 |
| 4.228838888888888 | 2.282 | 2.399 | 2.363 |
| 4.235658333333333 | 2.295 | 2.383 | 2.388 |
| 4.242416666666667 | 2.297 | 2.383 | 2.383 |
| 4.2492222222222225 | 2.315 | 2.363 | 2.383 |
| 4.256025 | 2.29 | 2.383 | 2.381 |
| 4.2628305555555555 | 2.305 | 2.363 | 2.393 |
| 4.269619444444444 | 2.307 | 2.378 | 2.404 |
| 4.276472222222222 | 2.318 | 2.388 | 2.393 |
| 4.283305555555556 | 2.318 | 2.404 | 2.409 |
| 4.29005 | 2.315 | 2.376 | 2.393 |
| 4.296822222222222 | 2.315 | 2.391 | 2.396 |
| 4.303613888888889 | 2.32 | 2.394 | 2.401 |
| 4.310402777777778 | 2.313 | 2.381 | 2.406 |
| 4.317205555555556 | 2.315 | 2.396 | 2.388 |
| 4.324041666666666 | 2.341 | 2.394 | 2.386 |
| 4.330847222222222 | 2.323 | 2.386 | 2.396 |
| 4.33765 | 2.305 | 2.396 | 2.404 |
| 4.3444416666666665 | 2.32 | 2.391 | 2.411 |
| 4.351186111111112 | 2.33 | 2.401 | 2.396 |
| 4.358036111111111 | 2.31 | 2.396 | 2.411 |
| 4.3648694444444445 | 2.327 | 2.433 | 2.409 |
| 4.371627777777778 | 2.393 | 2.461 | 2.463 |
| 4.378402777777778 | 2.382 | 2.48 | 2.448 |
| 4.385177777777778 | 2.377 | 2.458 | 2.458 |
| 4.391997222222223 | 2.372 | 2.441 | 2.447 |
| 4.3987694444444445 | 2.415 | 2.473 | 2.468 |
| 4.405605555555556 | 2.432 | 2.473 | 2.466 |
| 4.412380555555555 | 2.376 | 2.468 | 2.463 |
| 4.419155555555555 | 2.416 | 2.483 | 2.479 |
| 4.425944444444444 | 2.426 | 2.498 | 2.489 |
| 4.432794444444444 | 2.423 | 2.487 | 2.492 |
| 4.4395999999999995 | 2.446 | 2.495 | 2.512 |
| 4.446372222222222 | 2.453 | 2.505 | 2.489 |
| 4.453161111111111 | 2.428 | 2.507 | 2.489 |
| 4.459936111111111 | 2.453 | 2.5 | 2.499 |
| 4.466741666666667 | 2.436 | 2.497 | 2.507 |
| 4.473575 | 2.447 | 2.488 | 2.471 |
| 4.480352777777778 | 2.442 | 2.514 | 2.486 |
| 4.487094444444445 | 2.459 | 2.507 | 2.51 |
| 4.493975 | 2.441 | 2.528 | 2.51 |
| 4.50075 | 2.464 | 2.518 | 2.504 |
| 4.507555555555555 | 2.461 | 2.52 | 2.512 |
| 4.514327777777778 | 2.459 | 2.502 | 2.507 |
| 4.521116666666667 | 2.471 | 2.533 | 2.499 |
| 4.527966666666667 | 2.446 | 2.523 | 2.522 |
| 4.534741666666666 | 2.457 | 2.534 | 2.515 |
| 4.541547222222222 | 2.484 | 2.529 | 2.51 |
| 4.548322222222222 | 2.464 | 2.529 | 2.53 |
| 4.555155555555556 | 2.465 | 2.519 | 2.522 |
| 4.561930555555556 | 2.467 | 2.517 | 2.51 |
| 4.568705555555556 | 2.464 | 2.521 | 2.533 |
| 4.5755083333333335 | 2.488 | 2.526 | 2.527 |
| 4.5822972222222225 | 2.468 | 2.512 | 2.512 |
| 4.589133333333334 | 2.462 | 2.519 | 2.527 |
| 4.595938888888889 | 2.49 | 2.526 | 2.53 |
| 4.602741666666667 | 2.471 | 2.524 | 2.538 |
| 4.609516666666666 | 2.464 | 2.517 | 2.527 |
| 4.6163388888888885 | 2.468 | 2.529 | 2.522 |
| 4.623066666666667 | 2.471 | 2.554 | 2.538 |
| 4.629886111111111 | 2.477 | 2.527 | 2.538 |
| 4.636661111111111 | 2.47 | 2.535 | 2.54 |
| 4.643494444444445 | 2.462 | 2.543 | 2.548 |
| 4.650269444444445 | 2.477 | 2.535 | 2.538 |
| 4.657072222222222 | 2.485 | 2.525 | 2.543 |
| 4.663847222222222 | 2.477 | 2.515 | 2.538 |
| 4.670683333333333 | 2.457 | 2.527 | 2.54 |
| 4.6774861111111115 | 2.464 | 2.53 | 2.563 |
| 4.684261111111111 | 2.472 | 2.53 | 2.561 |
| 4.691097222222222 | 2.447 | 2.548 | 2.548 |
| 4.697886111111111 | 2.485 | 2.54 | 2.553 |
| 4.704675000000001 | 2.475 | 2.55 | 2.563 |
| 4.711480555555556 | 2.505 | 2.54 | 2.561 |
| 4.718255555555556 | 2.495 | 2.548 | 2.558 |
| 4.725027777777777 | 2.492 | 2.573 | 2.563 |
| 4.731877777777777 | 2.498 | 2.54 | 2.571 |
| 4.738675 | 2.498 | 2.563 | 2.555 |
| 4.745472222222222 | 2.492 | 2.556 | 2.548 |
| 4.752269444444444 | 2.503 | 2.566 | 2.568 |
| 4.759066666666667 | 2.518 | 2.571 | 2.581 |
| 4.765863888888889 | 2.515 | 2.576 | 2.576 |
| 4.772661111111112 | 2.5 | 2.571 | 2.558 |
| 4.779458333333333 | 2.51 | 2.573 | 2.584 |
| 4.786255555555556 | 2.508 | 2.571 | 2.576 |
| 4.7930527777777785 | 2.503 | 2.561 | 2.584 |
| 4.79985 | 2.523 | 2.584 | 2.596 |
| 4.806647222222223 | 2.51 | 2.576 | 2.568 |
| 4.813444444444444 | 2.513 | 2.581 | 2.571 |
| 4.820241666666666 | 2.513 | 2.591 | 2.599 |
| 4.827038888888889 | 2.508 | 2.604 | 2.589 |
| 4.833836111111111 | 2.518 | 2.579 | 2.586 |
| 4.840633333333333 | 2.528 | 2.563 | 2.599 |
| 4.8474305555555555 | 2.51 | 2.581 | 2.594 |
| 4.854227777777778 | 2.533 | 2.594 | 2.614 |
| 4.861025 | 2.521 | 2.579 | 2.584 |
| 4.867822222222222 | 2.515 | 2.568 | 2.601 |
| 4.874619444444445 | 2.513 | 2.581 | 2.599 |
| 4.8814166666666665 | 2.546 | 2.589 | 2.596 |
| 4.888213888888889 | 2.522 | 2.608 | 2.607 |
| 4.895011111111112 | 2.575 | 2.611 | 2.599 |
| 4.901808333333333 | 2.544 | 2.596 | 2.609 |
| 4.908605555555555 | 2.572 | 2.629 | 2.599 |
| 4.915402777777778 | 2.559 | 2.619 | 2.622 |
| 4.922199999999999 | 2.58 | 2.646 | 2.623 |
| 4.928997222222222 | 2.629 | 2.653 | 2.654 |
| 4.935794444444444 | 2.618 | 2.64 | 2.641 |
| 4.942591666666667 | 2.616 | 2.641 | 2.633 |
| 4.949388888888889 | 2.627 | 2.673 | 2.649 |
| 4.956186111111111 | 2.61 | 2.663 | 2.646 |
| 4.962983333333334 | 2.641 | 2.669 | 2.656 |
| 4.969780555555555 | 2.649 | 2.687 | 2.669 |
| 4.976577777777778 | 2.656 | 2.652 | 2.654 |
| 4.9833750000000006 | 2.646 | 2.675 | 2.664 |
| 4.990172222222222 | 2.628 | 2.692 | 2.649 |
| 4.996969444444445 | 2.651 | 2.677 | 2.679 |
| 5.003766666666667 | 2.669 | 2.68 | 2.664 |
| 5.010563888888888 | 2.649 | 2.7 | 2.669 |
| 5.017361111111111 | 2.659 | 2.685 | 2.674 |
| 5.024158333333333 | 2.675 | 2.688 | 2.677 |
| 5.030955555555555 | 2.654 | 2.705 | 2.677 |
| 5.0377527777777775 | 2.679 | 2.72 | 2.702 |
| 5.04455 | 2.684 | 2.771 | 2.718 |
| 5.051347222222222 | 2.679 | 2.863 | 2.779 |
| 5.058144444444444 | 2.674 | 2.976 | 2.845 |
| 5.064941666666667 | 2.684 | 3.108 | 2.947 |
| 5.071738888888889 | 2.69 | 3.279 | 3.047 |
| 5.078536111111111 | 2.697 | 3.44 | 3.131 |
| 5.085333333333334 | 2.715 | 3.631 | 3.264 |
| 5.092130555555555 | 2.683 | 3.832 | 3.376 |
| 5.098927777777778 | 2.698 | 3.988 | 3.501 |
| 5.1057250000000005 | 2.691 | 4.196 | 3.644 |
| 5.112522222222223 | 2.694 | 4.379 | 3.794 |
| 5.119319444444444 | 2.701 | 4.574 | 3.937 |
| 5.126116666666666 | 2.681 | 4.753 | 4.078 |
| 5.132913888888889 | 2.698 | 4.93 | 4.2 |
| 5.139711111111111 | 2.694 | 5.107 | 4.368 |
| 5.146508333333333 | 2.698 | 5.29 | 4.473 |
| 5.153305555555556 | 2.721 | 5.458 | 4.621 |
| 5.1601027777777775 | 2.716 | 5.637 | 4.756 |
| 5.1669 | 2.698 | 5.777 | 4.894 |
| 5.173697222222223 | 2.703 | 5.91 | 4.973 |
| 5.180494444444444 | 2.723 | 5.999 | 5.07 |
| 5.187291666666667 | 2.726 | 6.073 | 5.121 |
| 5.194088888888889 | 2.739 | 6.083 | 5.182 |
| 5.200886111111111 | 2.739 | 6.078 | 5.198 |
| 5.207683333333334 | 2.751 | 6.073 | 5.2 |
| 5.214480555555556 | 2.746 | 6.014 | 5.195 |
| 5.221277777777777 | 2.751 | 5.938 | 5.185 |
| 5.228075 | 2.789 | 5.875 | 5.149 |
| 5.234872222222222 | 2.781 | 5.814 | 5.162 |
| 5.241669444444444 | 2.853 | 5.803 | 5.153 |
| 5.248466666666666 | 2.873 | 5.693 | 5.097 |
| 5.255263888888889 | 2.862 | 5.615 | 5.064 |
| 5.262061111111111 | 2.872 | 5.511 | 5.031 |
| 5.268858333333333 | 2.875 | 5.434 | 4.982 |
| 5.275655555555556 | 2.88 | 5.342 | 4.911 |
| 5.282452777777778 | 2.887 | 5.24 | 4.865 |
| 5.28925 | 2.895 | 5.151 | 4.821 |
| 5.296047222222223 | 2.908 | 5.062 | 4.77 |
| 5.302844444444445 | 2.89 | 4.967 | 4.719 |
| 5.309641666666667 | 2.895 | 4.903 | 4.643 |
| 5.316438888888889 | 2.915 | 4.819 | 4.587 |
| 5.323236111111112 | 2.904 | 4.735 | 4.543 |
| 5.330033333333333 | 2.893 | 4.647 | 4.49 |
| 5.336830555555555 | 2.893 | 4.566 | 4.439 |
| 5.343627777777778 | 2.901 | 4.495 | 4.377 |
| 5.3504249999999995 | 2.908 | 4.441 | 4.344 |
| 5.357222222222222 | 2.906 | 4.395 | 4.281 |
| 5.364019444444445 | 2.914 | 4.321 | 4.24 |
| 5.370816666666666 | 2.901 | 4.24 | 4.189 |
| 5.377613888888889 | 2.898 | 4.186 | 4.155 |
| 5.3844111111111115 | 2.932 | 4.157 | 4.12 |
| 5.391208333333333 | 3.007 | 4.161 | 4.134 |
| 5.398005555555556 | 3.016 | 4.119 | 4.083 |
| 5.404802777777778 | 3.001 | 4.063 | 4.042 |
| 5.4116 | 3.009 | 4.027 | 4.006 |
| 5.4183972222222225 | 2.988 | 3.976 | 3.983 |
| 5.425194444444444 | 2.998 | 3.938 | 3.93 |
| 5.431991666666666 | 2.998 | 3.897 | 3.894 |
| 5.4387888888888885 | 3.019 | 3.864 | 3.863 |
| 5.445586111111111 | 3.003 | 3.825 | 3.851 |
| 5.452383333333334 | 3.024 | 3.795 | 3.823 |
| 5.459180555555555 | 3.005 | 3.771 | 3.792 |
| 5.465977777777778 | 2.988 | 3.724 | 3.764 |
| 5.472775 | 2.994 | 3.692 | 3.718 |
| 5.479572222222222 | 2.994 | 3.667 | 3.692 |
| 5.486369444444445 | 2.984 | 3.631 | 3.68 |
| 5.493166666666667 | 2.996 | 3.611 | 3.67 |
| 5.499963888888889 | 2.996 | 3.598 | 3.621 |
| 5.506761111111111 | 2.995 | 3.566 | 3.606 |
| 5.513558333333334 | 3.082 | 3.611 | 3.648 |
| 5.520355555555555 | 3.076 | 3.59 | 3.638 |
| 5.527152777777777 | 3.074 | 3.561 | 3.604 |
| 5.53395 | 3.089 | 3.544 | 3.566 |
| 5.540747222222222 | 3.089 | 3.551 | 3.561 |
| 5.547544444444444 | 3.079 | 3.531 | 3.551 |
| 5.554341666666667 | 3.099 | 3.51 | 3.53 |
| 5.561138888888888 | 3.089 | 3.5 | 3.51 |
| 5.567936111111111 | 3.086 | 3.457 | 3.472 |
| 5.5747333333333335 | 3.094 | 3.449 | 3.474 |
| 5.581530555555555 | 3.094 | 3.444 | 3.469 |
| 5.588327777777778 | 3.066 | 3.413 | 3.456 |
| 5.595125 | 3.069 | 3.407 | 3.446 |
| 5.601922222222222 | 3.049 | 3.4 | 3.423 |
| 5.608719444444445 | 3.069 | 3.367 | 3.418 |
| 5.615516666666667 | 3.072 | 3.354 | 3.408 |
| 5.62231388888889 | 3.077 | 3.352 | 3.382 |
| 5.6291111111111105 | 3.098 | 3.367 | 3.396 |
| 5.635908333333333 | 3.143 | 3.385 | 3.442 |
| 5.642705555555556 | 3.167 | 3.402 | 3.422 |
| 5.649502777777777 | 3.172 | 3.4 | 3.414 |
| 5.6563 | 3.159 | 3.389 | 3.417 |
| 5.6630972222222224 | 3.18 | 3.382 | 3.402 |
| 5.669894444444444 | 3.152 | 3.392 | 3.394 |
| 5.676691666666667 | 3.152 | 3.356 | 3.363 |
| 5.683488888888889 | 3.159 | 3.354 | 3.369 |
| 5.690286111111111 | 3.157 | 3.348 | 3.353 |
| 5.6970833333333335 | 3.149 | 3.348 | 3.353 |
| 5.703880555555556 | 3.152 | 3.332 | 3.34 |
| 5.710677777777778 | 3.127 | 3.321 | 3.338 |
| 5.717475 | 3.122 | 3.312 | 3.351 |
| 5.724272222222223 | 3.132 | 3.305 | 3.325 |
| 5.731069444444444 | 3.119 | 3.307 | 3.325 |
| 5.737866666666666 | 3.145 | 3.312 | 3.341 |
| 5.744663888888889 | 3.181 | 3.339 | 3.344 |
| 5.7514611111111105 | 3.202 | 3.359 | 3.349 |
| 5.758258333333333 | 3.229 | 3.375 | 3.367 |
| 5.765055555555556 | 3.212 | 3.36 | 3.36 |
| 5.771852777777777 | 3.214 | 3.352 | 3.342 |
| 5.77865 | 3.212 | 3.345 | 3.347 |
| 5.785447222222222 | 3.217 | 3.337 | 3.355 |
| 5.792244444444445 | 3.217 | 3.342 | 3.332 |
| 5.799041666666667 | 3.214 | 3.337 | 3.329 |
| 5.805838888888889 | 3.217 | 3.335 | 3.321 |
| 5.812636111111112 | 3.213 | 3.313 | 3.316 |
| 5.8194333333333335 | 3.188 | 3.311 | 3.306 |
| 5.826230555555556 | 3.168 | 3.315 | 3.332 |
| 5.833027777777779 | 3.192 | 3.329 | 3.324 |
| 5.839824999999999 | 3.192 | 3.293 | 3.306 |
| 5.846622222222222 | 3.169 | 3.296 | 3.291 |
| 5.8534194444444445 | 3.268 | 3.355 | 3.351 |
| 5.860216666666666 | 3.274 | 3.387 | 3.358 |
| 5.867013888888889 | 3.277 | 3.369 | 3.346 |
| 5.873811111111111 | 3.266 | 3.354 | 3.348 |
| 5.880608333333333 | 3.279 | 3.366 | 3.33 |
| 5.887405555555556 | 3.277 | 3.359 | 3.333 |
| 5.894202777777778 | 3.282 | 3.338 | 3.341 |
| 5.901 | 3.277 | 3.328 | 3.315 |
| 5.907797222222222 | 3.282 | 3.338 | 3.336 |
| 5.914594444444445 | 3.273 | 3.332 | 3.333 |
| 5.921391666666667 | 3.252 | 3.337 | 3.31 |
| 5.928188888888889 | 3.249 | 3.314 | 3.313 |
| 5.934986111111112 | 3.249 | 3.318 | 3.307 |
| 5.9417833333333325 | 3.278 | 3.324 | 3.328 |
| 5.948580555555555 | 3.325 | 3.371 | 3.357 |
| 5.955377777777778 | 3.334 | 3.378 | 3.373 |
| 5.962175 | 3.339 | 3.373 | 3.367 |
| 5.968972222222222 | 3.314 | 3.383 | 3.365 |
| 5.9757694444444445 | 3.319 | 3.368 | 3.352 |
| 5.982566666666667 | 3.329 | 3.375 | 3.342 |
| 5.989363888888889 | 3.309 | 3.365 | 3.339 |
| 5.996161111111111 | 3.332 | 3.37 | 3.352 |
| 6.002958333333334 | 3.296 | 3.381 | 3.35 |
| 6.0097555555555555 | 3.321 | 3.365 | 3.365 |
| 6.016552777777778 | 3.292 | 3.352 | 3.342 |
| 6.023350000000001 | 3.32 | 3.378 | 3.348 |
| 6.030147222222222 | 3.326 | 3.391 | 3.363 |
| 6.036944444444444 | 3.343 | 3.43 | 3.397 |
| 6.043741666666667 | 3.379 | 3.428 | 3.392 |
| 6.050538888888888 | 3.353 | 3.41 | 3.389 |
| 6.057336111111111 | 3.364 | 3.402 | 3.382 |
| 6.064133333333333 | 3.341 | 3.405 | 3.384 |
| 6.070930555555555 | 3.374 | 3.39 | 3.376 |
| 6.077727777777778 | 3.341 | 3.405 | 3.369 |
| 6.084525 | 3.333 | 3.387 | 3.356 |
| 6.091322222222222 | 3.318 | 3.39 | 3.359 |
| 6.098119444444444 | 3.323 | 3.385 | 3.354 |
| 6.104916666666667 | 3.316 | 3.373 | 3.351 |
| 6.111713888888889 | 3.358 | 3.423 | 3.405 |
| 6.118511111111111 | 3.379 | 3.435 | 3.413 |
| 6.125308333333334 | 3.37 | 3.442 | 3.419 |
| 6.132105555555556 | 3.393 | 3.439 | 3.421 |
| 6.138902777777777 | 3.39 | 3.429 | 3.416 |
| 6.1457 | 3.39 | 3.447 | 3.403 |
| 6.152497222222222 | 3.37 | 3.429 | 3.421 |
| 6.159294444444444 | 3.37 | 3.434 | 3.398 |
| 6.1660916666666665 | 3.375 | 3.422 | 3.393 |
| 6.172888888888889 | 3.39 | 3.437 | 3.393 |
| 6.179686111111111 | 3.388 | 3.437 | 3.401 |
| 6.186483333333333 | 3.39 | 3.411 | 3.403 |
| 6.193280555555556 | 3.347 | 3.418 | 3.398 |
| 6.200077777777778 | 3.348 | 3.425 | 3.398 |
| 6.206875 | 3.327 | 3.406 | 3.391 |
| 6.213672222222223 | 3.364 | 3.426 | 3.411 |
| 6.220469444444444 | 3.411 | 3.455 | 3.44 |
| 6.227266666666667 | 3.407 | 3.464 | 3.425 |
| 6.2340638888888895 | 3.433 | 3.477 | 3.44 |
| 6.24086111111111 | 3.422 | 3.471 | 3.451 |
| 6.247658333333333 | 3.412 | 3.461 | 3.453 |
| 6.254455555555555 | 3.43 | 3.466 | 3.448 |
| 6.261252777777777 | 3.435 | 3.464 | 3.463 |
| 6.26805 | 3.433 | 3.461 | 3.463 |
| 6.274847222222222 | 3.422 | 3.451 | 3.463 |
| 6.281644444444444 | 3.44 | 3.456 | 3.451 |
| 6.2884416666666665 | 3.417 | 3.456 | 3.44 |
| 6.295238888888889 | 3.407 | 3.466 | 3.42 |
| 6.302036111111112 | 3.433 | 3.469 | 3.448 |
| 6.308833333333333 | 3.412 | 3.456 | 3.451 |
| 6.315630555555556 | 3.42 | 3.461 | 3.456 |
| 6.322427777777778 | 3.422 | 3.464 | 3.43 |
| 6.329225 | 3.41 | 3.47 | 3.456 |
| 6.336022222222223 | 3.407 | 3.444 | 3.438 |
| 6.342819444444445 | 3.405 | 3.457 | 3.44 |
| 6.349616666666666 | 3.375 | 3.453 | 3.43 |
| 6.356413888888889 | 3.395 | 3.44 | 3.43 |
| 6.363211111111111 | 3.405 | 3.435 | 3.417 |
| 6.370008333333333 | 3.385 | 3.446 | 3.433 |
| 6.376805555555555 | 3.398 | 3.435 | 3.438 |
| 6.383602777777778 | 3.395 | 3.451 | 3.428 |
| 6.3904 | 3.413 | 3.44 | 3.412 |
| 6.397197222222222 | 3.386 | 3.455 | 3.441 |
| 6.403994444444445 | 3.408 | 3.463 | 3.446 |
| 6.410791666666666 | 3.454 | 3.499 | 3.464 |
| 6.417588888888889 | 3.41 | 3.48 | 3.464 |
| 6.424386111111112 | 3.468 | 3.522 | 3.485 |
| 6.431183333333333 | 3.49 | 3.524 | 3.483 |
| 6.437980555555556 | 3.503 | 3.531 | 3.5 |
| 6.444777777777778 | 3.495 | 3.521 | 3.495 |
| 6.451574999999999 | 3.495 | 3.516 | 3.493 |
| 6.458372222222222 | 3.477 | 3.508 | 3.503 |
| 6.465169444444444 | 3.48 | 3.519 | 3.498 |
| 6.471966666666667 | 3.498 | 3.516 | 3.488 |
| 6.4787638888888885 | 3.488 | 3.519 | 3.503 |
| 6.485561111111111 | 3.505 | 3.511 | 3.5 |
| 6.492358333333334 | 3.5 | 3.531 | 3.49 |
| 6.499155555555555 | 3.49 | 3.534 | 3.506 |
| 6.505952777777778 | 3.5 | 3.516 | 3.513 |
| 6.5127500000000005 | 3.49 | 3.521 | 3.506 |
| 6.519547222222222 | 3.5 | 3.524 | 3.506 |
| 6.526344444444445 | 3.505 | 3.521 | 3.493 |
| 6.533141666666667 | 3.503 | 3.539 | 3.503 |
| 6.539938888888889 | 3.5 | 3.529 | 3.506 |
| 6.5467361111111115 | 3.513 | 3.521 | 3.503 |
| 6.553533333333334 | 3.521 | 3.521 | 3.48 |
| 6.560330555555555 | 3.512 | 3.512 | 3.511 |
| 6.5671277777777775 | 3.513 | 3.529 | 3.503 |
| 6.573925 | 3.49 | 3.508 | 3.521 |
| 6.580722222222222 | 3.505 | 3.525 | 3.508 |
| 6.587519444444444 | 3.501 | 3.526 | 3.518 |
| 6.594316666666667 | 3.511 | 3.512 | 3.518 |
| 6.6011138888888885 | 3.493 | 3.534 | 3.521 |
| 6.607911111111111 | 3.495 | 3.527 | 3.511 |
| 6.614708333333334 | 3.499 | 3.527 | 3.518 |
| 6.621505555555555 | 3.481 | 3.523 | 3.5 |
| 6.628302777777778 | 3.508 | 3.525 | 3.523 |
| 6.6351 | 3.486 | 3.539 | 3.511 |
| 6.641897222222223 | 3.498 | 3.529 | 3.503 |
| 6.648694444444445 | 3.493 | 3.523 | 3.521 |
| 6.655491666666666 | 3.504 | 3.521 | 3.531 |
| 6.662288888888889 | 3.511 | 3.526 | 3.513 |
| 6.669086111111111 | 3.514 | 3.549 | 3.516 |
| 6.675883333333333 | 3.514 | 3.549 | 3.531 |
| 6.682680555555556 | 3.491 | 3.536 | 3.541 |
| 6.689477777777777 | 3.516 | 3.546 | 3.534 |
| 6.696275 | 3.524 | 3.541 | 3.526 |
| 6.7030722222222225 | 3.521 | 3.552 | 3.544 |
| 6.709869444444444 | 3.506 | 3.531 | 3.539 |
| 6.716666666666667 | 3.527 | 3.557 | 3.534 |
| 6.723463888888889 | 3.511 | 3.544 | 3.544 |
| 6.730261111111111 | 3.537 | 3.562 | 3.551 |
| 6.737058333333334 | 3.527 | 3.552 | 3.554 |
| 6.743855555555556 | 3.527 | 3.554 | 3.554 |
| 6.750652777777777 | 3.511 | 3.559 | 3.549 |
| 6.7574499999999995 | 3.529 | 3.569 | 3.536 |
| 6.764247222222222 | 3.55 | 3.549 | 3.546 |
| 6.771044444444444 | 3.524 | 3.564 | 3.562 |
| 6.777841666666666 | 3.527 | 3.574 | 3.562 |
| 6.784638888888889 | 3.527 | 3.562 | 3.557 |
| 6.791436111111111 | 3.537 | 3.564 | 3.567 |
| 6.798233333333333 | 3.527 | 3.567 | 3.564 |
| 6.805030555555556 | 3.544 | 3.569 | 3.562 |
| 6.811827777777778 | 3.544 | 3.577 | 3.585 |
| 6.818625 | 3.56 | 3.554 | 3.572 |
| 6.8254222222222225 | 3.552 | 3.577 | 3.564 |
| 6.832219444444445 | 3.547 | 3.572 | 3.569 |
| 6.839016666666667 | 3.562 | 3.587 | 3.567 |
| 6.845813888888889 | 3.57 | 3.567 | 3.557 |
| 6.852611111111112 | 3.575 | 3.582 | 3.582 |
| 6.859408333333333 | 3.567 | 3.587 | 3.574 |
| 6.866205555555555 | 3.562 | 3.58 | 3.569 |
| 6.873002777777778 | 3.588 | 3.605 | 3.59 |
| 6.8797999999999995 | 3.585 | 3.592 | 3.597 |
| 6.886597222222222 | 3.583 | 3.587 | 3.587 |
| 6.893394444444445 | 3.583 | 3.613 | 3.582 |
| 6.900191666666666 | 3.593 | 3.608 | 3.6 |
| 6.906988888888889 | 3.56 | 3.603 | 3.592 |
| 6.913786111111111 | 3.578 | 3.605 | 3.59 |
| 6.920583333333333 | 3.583 | 3.613 | 3.59 |
| 6.927380555555556 | 3.59 | 3.633 | 3.608 |
| 6.934177777777778 | 3.585 | 3.61 | 3.595 |
| 6.940975 | 3.606 | 3.608 | 3.603 |
| 6.9477722222222225 | 3.611 | 3.618 | 3.603 |
| 6.954569444444445 | 3.611 | 3.613 | 3.6 |
| 6.961366666666666 | 3.598 | 3.623 | 3.605 |
| 6.968163888888888 | 3.59 | 3.62 | 3.625 |
| 6.974961111111111 | 3.588 | 3.633 | 3.615 |
| 6.9817583333333335 | 3.606 | 3.623 | 3.595 |
| 6.988555555555555 | 3.606 | 3.648 | 3.618 |
| 6.995352777777778 | 3.593 | 3.628 | 3.636 |
| 7.00215 | 3.598 | 3.648 | 3.648 |
| 7.008947222222222 | 3.593 | 3.651 | 3.633 |
| 7.015744444444445 | 3.593 | 3.638 | 3.628 |
| 7.022541666666667 | 3.612 | 3.64 | 3.638 |
| 7.029338888888889 | 3.606 | 3.641 | 3.631 |
| 7.036136111111111 | 3.599 | 3.657 | 3.62 |
| 7.042933333333334 | 3.618 | 3.656 | 3.641 |
| 7.049730555555556 | 3.602 | 3.675 | 3.638 |
| 7.056527777777778 | 3.616 | 3.641 | 3.641 |
| 7.063325000000001 | 3.634 | 3.648 | 3.643 |
| 7.0701222222222215 | 3.623 | 3.661 | 3.646 |
| 7.076919444444444 | 3.633 | 3.65 | 3.638 |
| 7.083716666666667 | 3.647 | 3.663 | 3.633 |
| 7.090513888888888 | 3.638 | 3.668 | 3.661 |
| 7.097311111111111 | 3.621 | 3.677 | 3.651 |
| 7.1041083333333335 | 3.627 | 3.686 | 3.654 |
| 7.110905555555555 | 3.631 | 3.674 | 3.666 |
| 7.117702777777778 | 3.63 | 3.66 | 3.666 |
| 7.1245 | 3.631 | 3.664 | 3.669 |
| 7.131297222222222 | 3.654 | 3.678 | 3.671 |
| 7.1380944444444445 | 3.622 | 3.678 | 3.661 |
| 7.144891666666667 | 3.656 | 3.701 | 3.664 |
| 7.15168888888889 | 3.654 | 3.679 | 3.661 |
| 7.158486111111111 | 3.629 | 3.666 | 3.656 |
| 7.165283333333334 | 3.667 | 3.686 | 3.664 |
| 7.172080555555556 | 3.653 | 3.683 | 3.664 |
| 7.178877777777777 | 3.666 | 3.678 | 3.684 |
| 7.185675 | 3.65 | 3.69 | 3.658 |
| 7.192472222222222 | 3.632 | 3.688 | 3.663 |
| 7.199269444444444 | 3.649 | 3.698 | 3.674 |
| 7.206066666666667 | 3.663 | 3.685 | 3.664 |
| 7.212863888888889 | 3.638 | 3.654 | 3.668 |
| 7.219661111111111 | 3.61 | 3.654 | 3.653 |
| 7.226458333333333 | 3.654 | 3.686 | 3.661 |
| 7.233255555555556 | 3.646 | 3.678 | 3.663 |
| 7.240052777777778 | 3.619 | 3.658 | 3.653 |
| 7.24685 | 3.626 | 3.66 | 3.645 |
| 7.253647222222223 | 3.672 | 3.7 | 3.663 |
| 7.2604444444444445 | 3.626 | 3.66 | 3.655 |
| 7.267241666666666 | 3.607 | 3.628 | 3.634 |
| 7.274038888888889 | 3.666 | 3.68 | 3.666 |
| 7.28083611111111 | 3.644 | 3.669 | 3.668 |
| 7.287633333333333 | 3.621 | 3.65 | 3.652 |
| 7.2944305555555555 | 3.629 | 3.664 | 3.655 |
| 7.301227777777777 | 3.642 | 3.672 | 3.668 |
| 7.308025 | 3.637 | 3.67 | 3.639 |
| 7.314822222222222 | 3.637 | 3.665 | 3.655 |
| 7.321619444444445 | 3.625 | 3.657 | 3.65 |
| 7.328416666666667 | 3.625 | 3.662 | 3.647 |
| 7.335213888888889 | 3.64 | 3.678 | 3.65 |
| 7.342011111111112 | 3.658 | 3.678 | 3.673 |
| 7.348808333333333 | 3.653 | 3.688 | 3.66 |
| 7.355605555555556 | 3.643 | 3.683 | 3.668 |
| 7.3624027777777785 | 3.66 | 3.678 | 3.662 |
| 7.369199999999999 | 3.655 | 3.69 | 3.68 |
| 7.375997222222222 | 3.668 | 3.68 | 3.683 |
| 7.382794444444444 | 3.645 | 3.675 | 3.655 |
| 7.389591666666666 | 3.66 | 3.693 | 3.683 |
| 7.396388888888889 | 3.668 | 3.698 | 3.698 |
| 7.403186111111111 | 3.666 | 3.69 | 3.693 |
| 7.409983333333333 | 3.655 | 3.69 | 3.685 |
| 7.4167805555555555 | 3.668 | 3.678 | 3.706 |
| 7.423577777777778 | 3.673 | 3.693 | 3.713 |
| 7.430375 | 3.676 | 3.706 | 3.678 |
| 7.437172222222222 | 3.681 | 3.716 | 3.701 |
| 7.443969444444445 | 3.691 | 3.708 | 3.706 |
| 7.4507666666666665 | 3.671 | 3.716 | 3.703 |
| 7.457563888888889 | 3.688 | 3.716 | 3.719 |
| 7.464361111111112 | 3.686 | 3.711 | 3.696 |
| 7.4711583333333325 | 3.681 | 3.724 | 3.711 |
| 7.477955555555555 | 3.694 | 3.719 | 3.708 |
| 7.484752777777778 | 3.699 | 3.726 | 3.716 |
| 7.49155 | 3.699 | 3.711 | 3.726 |
| 7.498347222222222 | 3.704 | 3.726 | 3.721 |
| 7.505144444444444 | 3.719 | 3.739 | 3.729 |
| 7.511941666666667 | 3.696 | 3.734 | 3.742 |
| 7.518738888888889 | 3.717 | 3.744 | 3.726 |